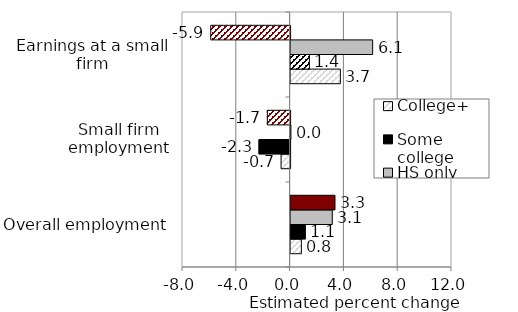
| Category | College+ | Some college | HS only | Less than HS |
|---|---|---|---|---|
| Overall employment | 0.8 | 1.1 | 3.1 | 3.3 |
| Small firm employment | -0.671 | -2.311 | 0.024 | -1.691 |
| Earnings at a small firm | 3.7 | 1.4 | 6.1 | -5.9 |